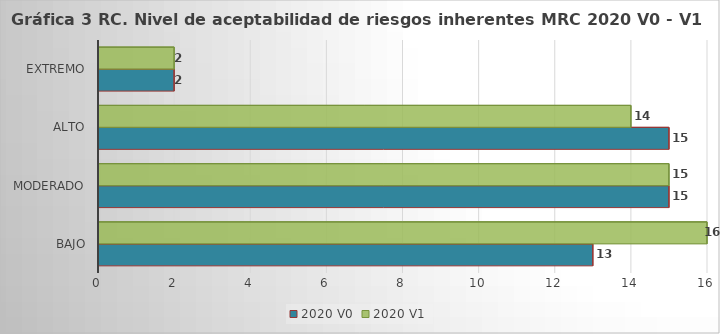
| Category | 2020 V0 | 2020 V1 |
|---|---|---|
| Bajo | 13 | 16 |
| Moderado | 15 | 15 |
| Alto | 15 | 14 |
| Extremo | 2 | 2 |